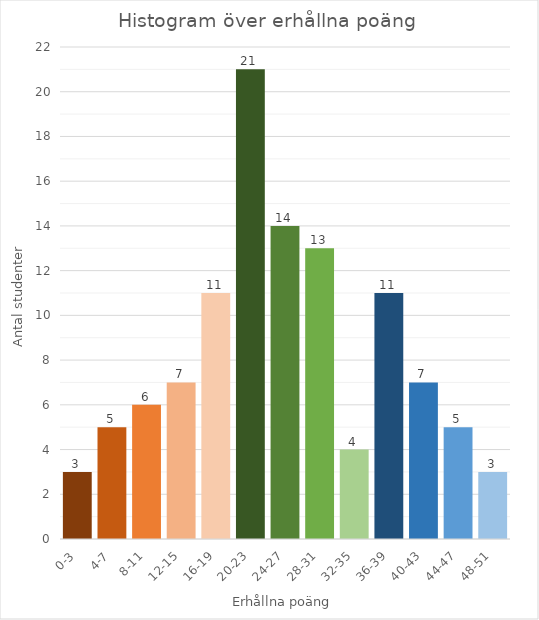
| Category | Antal
studenter |
|---|---|
| 0-3 | 3 |
| 4-7 | 5 |
| 8-11 | 6 |
| 12-15 | 7 |
| 16-19 | 11 |
| 20-23 | 21 |
| 24-27 | 14 |
| 28-31 | 13 |
| 32-35 | 4 |
| 36-39 | 11 |
| 40-43 | 7 |
| 44-47 | 5 |
| 48-51 | 3 |